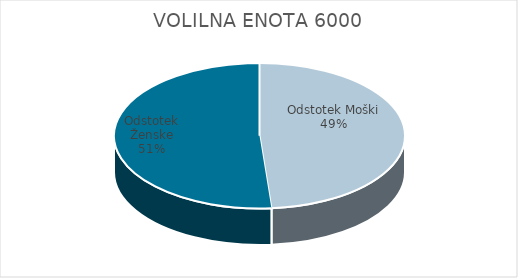
| Category | VOLILNA ENOTA 6000 | #REF! | Slovenija skupaj |
|---|---|---|---|
| Odstotek Moški | 19.96 |  | 19.85 |
| Odstotek Ženske | 21.03 |  | 21.47 |